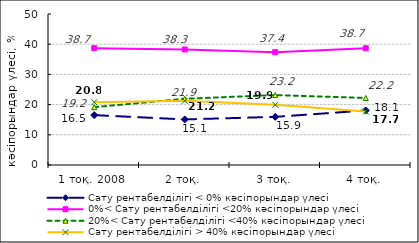
| Category | Сату рентабелділігі < 0% кәсіпорындар үлесі | 0%< Сату рентабелділігі <20% кәсіпорындар үлесі | 20%< Сату рентабелділігі <40% кәсіпорындар үлесі | Сату рентабелділігі > 40% кәсіпорындар үлесі |
|---|---|---|---|---|
| 1 тоқ. 2008  | 16.52 | 38.69 | 19.15 | 20.76 |
| 2 тоқ. | 15.09 | 38.26 | 21.93 | 21.24 |
| 3 тоқ. | 15.94 | 37.37 | 23.16 | 19.92 |
| 4 тоқ. | 18.05 | 38.66 | 22.19 | 17.69 |